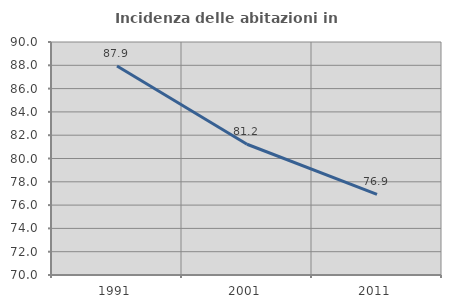
| Category | Incidenza delle abitazioni in proprietà  |
|---|---|
| 1991.0 | 87.94 |
| 2001.0 | 81.223 |
| 2011.0 | 76.923 |